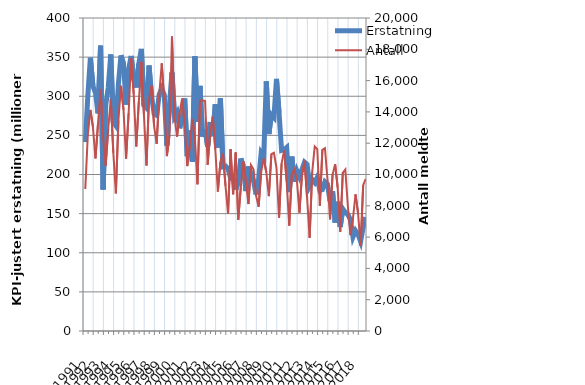
| Category | Erstatning |
|---|---|
| 1991.0 | 241.512 |
| nan | 300.484 |
| nan | 349.229 |
| nan | 312.784 |
| 1992.0 | 304.478 |
| nan | 278.208 |
| nan | 364.59 |
| nan | 180.822 |
| 1993.0 | 288.461 |
| nan | 310.805 |
| nan | 353.36 |
| nan | 266.815 |
| 1994.0 | 262.274 |
| nan | 315.803 |
| nan | 352.253 |
| nan | 341.743 |
| 1995.0 | 289.353 |
| nan | 334.727 |
| nan | 351.511 |
| nan | 321.88 |
| 1996.0 | 311.182 |
| nan | 341.606 |
| nan | 360.422 |
| nan | 288.15 |
| 1997.0 | 284.885 |
| nan | 339.314 |
| nan | 300.337 |
| nan | 277.65 |
| 1998.0 | 275.579 |
| nan | 302.306 |
| nan | 309.99 |
| nan | 301.649 |
| 1999.0 | 236.975 |
| nan | 287.546 |
| nan | 330.467 |
| nan | 274.094 |
| 2000.0 | 279.396 |
| nan | 259.108 |
| nan | 271.791 |
| nan | 297.135 |
| 2001.0 | 223.442 |
| nan | 256.28 |
| nan | 216.416 |
| nan | 351.008 |
| 2002.0 | 267.246 |
| nan | 313.315 |
| nan | 248.469 |
| nan | 257.968 |
| 2003.0 | 235.696 |
| nan | 267.073 |
| nan | 249.034 |
| nan | 289.563 |
| 2004.0 | 234.508 |
| nan | 297.283 |
| nan | 210.036 |
| nan | 210.913 |
| 2005.0 | 207.315 |
| nan | 195.391 |
| nan | 196.202 |
| nan | 180.683 |
| 2006.0 | 190.639 |
| nan | 220.461 |
| nan | 210.264 |
| nan | 178.732 |
| 2007.0 | 210.283 |
| nan | 200.876 |
| nan | 191.579 |
| nan | 174.481 |
| 2008.0 | 193.854 |
| nan | 227.933 |
| nan | 223.378 |
| nan | 319.11 |
| 2009.0 | 251.747 |
| nan | 276.295 |
| nan | 272.836 |
| nan | 322.248 |
| 2010.0 | 278.8 |
| nan | 230.847 |
| nan | 231.794 |
| nan | 234.558 |
| 2011.0 | 177.415 |
| nan | 222.865 |
| nan | 190.831 |
| nan | 204.834 |
| 2012.0 | 196.954 |
| nan | 206.447 |
| nan | 215.756 |
| nan | 212.921 |
| 2013.0 | 186.273 |
| nan | 193.614 |
| nan | 189.634 |
| nan | 196.473 |
| 2014.0 | 179.514 |
| nan | 180.663 |
| nan | 190.729 |
| nan | 187.76 |
| 2015.0 | 165.698 |
| nan | 178.529 |
| nan | 138.58 |
| nan | 165.16 |
| 2016.0 | 133.009 |
| nan | 156.105 |
| nan | 151.513 |
| nan | 148.772 |
| 2017.0 | 142.307 |
| nan | 120.109 |
| nan | 128.261 |
| nan | 123.332 |
| 2018.0 | 114.373 |
| nan | 132.74 |
| nan | 145.624 |